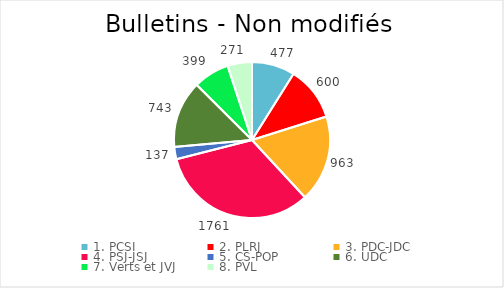
| Category | Series 0 |
|---|---|
| 1. PCSI | 477 |
| 2. PLRJ | 600 |
| 3. PDC-JDC | 963 |
| 4. PSJ-JSJ | 1761 |
| 5. CS-POP | 137 |
| 6. UDC | 743 |
| 7. Verts et JVJ | 399 |
| 8. PVL | 271 |